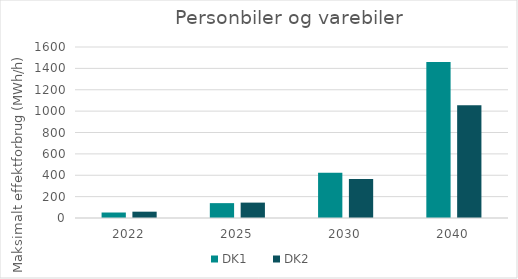
| Category | DK1 | DK2 |
|---|---|---|
| 2022.0 | 51.368 | 59.173 |
| 2025.0 | 139.088 | 143.952 |
| 2030.0 | 422.739 | 366.071 |
| 2040.0 | 1458.877 | 1054.554 |